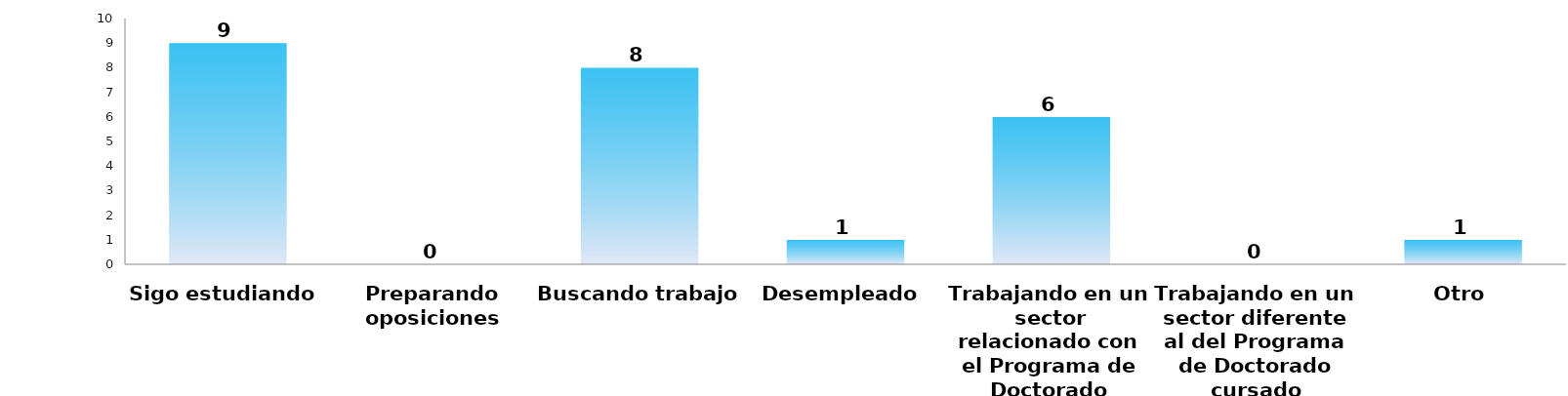
| Category | Series 0 |
|---|---|
| Sigo estudiando | 9 |
| Preparando oposiciones | 0 |
| Buscando trabajo | 8 |
| Desempleado | 1 |
| Trabajando en un sector relacionado con el Programa de Doctorado cursado | 6 |
| Trabajando en un sector diferente al del Programa de Doctorado cursado | 0 |
| Otro | 1 |